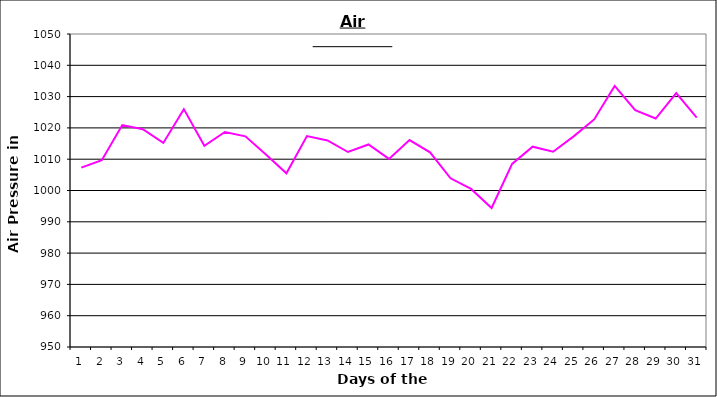
| Category | Series 0 |
|---|---|
| 0 | 1007.3 |
| 1 | 1009.7 |
| 2 | 1020.9 |
| 3 | 1019.6 |
| 4 | 1015.2 |
| 5 | 1026 |
| 6 | 1014.3 |
| 7 | 1018.7 |
| 8 | 1017.3 |
| 9 | 1011.5 |
| 10 | 1005.5 |
| 11 | 1017.4 |
| 12 | 1016 |
| 13 | 1012.3 |
| 14 | 1014.7 |
| 15 | 1010.1 |
| 16 | 1016.1 |
| 17 | 1012.2 |
| 18 | 1003.9 |
| 19 | 1000.5 |
| 20 | 994.4 |
| 21 | 1008.5 |
| 22 | 1014 |
| 23 | 1012.4 |
| 24 | 1017.3 |
| 25 | 1022.7 |
| 26 | 1033.4 |
| 27 | 1025.7 |
| 28 | 1023 |
| 29 | 1031.1 |
| 30 | 1023.3 |